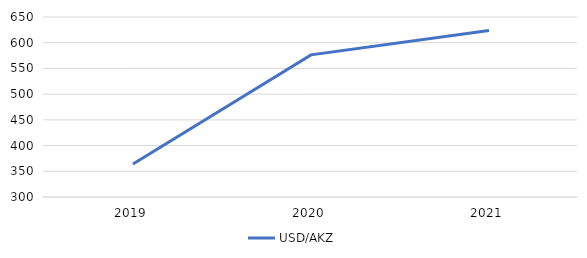
| Category | USD/AKZ |
|---|---|
| 2019.0 | 364.279 |
| 2020.0 | 576.367 |
| 2021.0 | 623.706 |